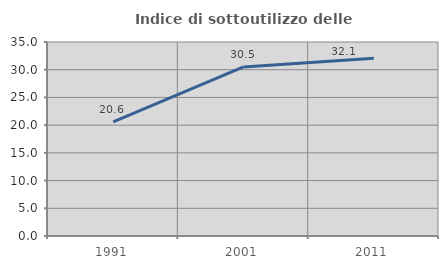
| Category | Indice di sottoutilizzo delle abitazioni  |
|---|---|
| 1991.0 | 20.587 |
| 2001.0 | 30.506 |
| 2011.0 | 32.079 |